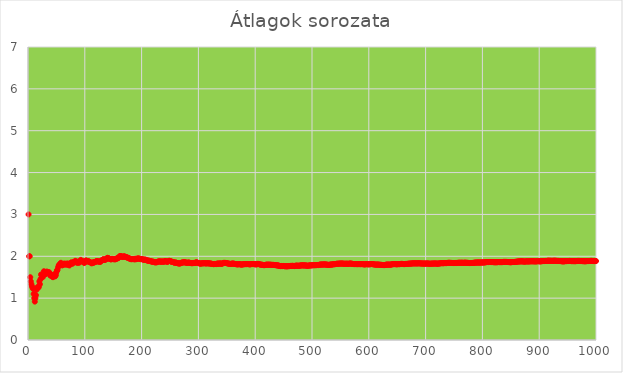
| Category | Series 0 |
|---|---|
| 1.0 | 3 |
| 2.0 | 2 |
| 3.0 | 2 |
| 4.0 | 1.5 |
| 5.0 | 1.4 |
| 6.0 | 1.333 |
| 7.0 | 1.286 |
| 8.0 | 1.25 |
| 9.0 | 1.222 |
| 10.0 | 1.1 |
| 11.0 | 1 |
| 12.0 | 0.917 |
| 13.0 | 1 |
| 14.0 | 1.071 |
| 15.0 | 1.2 |
| 16.0 | 1.25 |
| 17.0 | 1.235 |
| 18.0 | 1.278 |
| 19.0 | 1.263 |
| 20.0 | 1.4 |
| 21.0 | 1.333 |
| 22.0 | 1.455 |
| 23.0 | 1.565 |
| 24.0 | 1.542 |
| 25.0 | 1.52 |
| 26.0 | 1.5 |
| 27.0 | 1.556 |
| 28.0 | 1.643 |
| 29.0 | 1.621 |
| 30.0 | 1.567 |
| 31.0 | 1.581 |
| 32.0 | 1.594 |
| 33.0 | 1.636 |
| 34.0 | 1.618 |
| 35.0 | 1.6 |
| 36.0 | 1.611 |
| 37.0 | 1.622 |
| 38.0 | 1.579 |
| 39.0 | 1.538 |
| 40.0 | 1.575 |
| 41.0 | 1.537 |
| 42.0 | 1.548 |
| 43.0 | 1.512 |
| 44.0 | 1.5 |
| 45.0 | 1.556 |
| 46.0 | 1.565 |
| 47.0 | 1.532 |
| 48.0 | 1.521 |
| 49.0 | 1.551 |
| 50.0 | 1.62 |
| 51.0 | 1.667 |
| 52.0 | 1.673 |
| 53.0 | 1.736 |
| 54.0 | 1.778 |
| 55.0 | 1.8 |
| 56.0 | 1.804 |
| 57.0 | 1.825 |
| 58.0 | 1.845 |
| 59.0 | 1.814 |
| 60.0 | 1.783 |
| 61.0 | 1.787 |
| 62.0 | 1.806 |
| 63.0 | 1.81 |
| 64.0 | 1.828 |
| 65.0 | 1.8 |
| 66.0 | 1.818 |
| 67.0 | 1.806 |
| 68.0 | 1.824 |
| 69.0 | 1.797 |
| 70.0 | 1.829 |
| 71.0 | 1.817 |
| 72.0 | 1.792 |
| 73.0 | 1.781 |
| 74.0 | 1.824 |
| 75.0 | 1.813 |
| 76.0 | 1.855 |
| 77.0 | 1.844 |
| 78.0 | 1.821 |
| 79.0 | 1.848 |
| 80.0 | 1.862 |
| 81.0 | 1.852 |
| 82.0 | 1.854 |
| 83.0 | 1.892 |
| 84.0 | 1.881 |
| 85.0 | 1.859 |
| 86.0 | 1.86 |
| 87.0 | 1.839 |
| 88.0 | 1.875 |
| 89.0 | 1.865 |
| 90.0 | 1.844 |
| 91.0 | 1.879 |
| 92.0 | 1.88 |
| 93.0 | 1.914 |
| 94.0 | 1.894 |
| 95.0 | 1.874 |
| 96.0 | 1.885 |
| 97.0 | 1.876 |
| 98.0 | 1.857 |
| 99.0 | 1.838 |
| 100.0 | 1.87 |
| 101.0 | 1.871 |
| 102.0 | 1.902 |
| 103.0 | 1.893 |
| 104.0 | 1.875 |
| 105.0 | 1.876 |
| 106.0 | 1.887 |
| 107.0 | 1.879 |
| 108.0 | 1.861 |
| 109.0 | 1.862 |
| 110.0 | 1.855 |
| 111.0 | 1.847 |
| 112.0 | 1.83 |
| 113.0 | 1.841 |
| 114.0 | 1.842 |
| 115.0 | 1.861 |
| 116.0 | 1.845 |
| 117.0 | 1.863 |
| 118.0 | 1.864 |
| 119.0 | 1.866 |
| 120.0 | 1.883 |
| 121.0 | 1.884 |
| 122.0 | 1.877 |
| 123.0 | 1.878 |
| 124.0 | 1.879 |
| 125.0 | 1.872 |
| 126.0 | 1.873 |
| 127.0 | 1.866 |
| 128.0 | 1.875 |
| 129.0 | 1.899 |
| 130.0 | 1.9 |
| 131.0 | 1.908 |
| 132.0 | 1.924 |
| 133.0 | 1.932 |
| 134.0 | 1.918 |
| 135.0 | 1.911 |
| 136.0 | 1.926 |
| 137.0 | 1.92 |
| 138.0 | 1.935 |
| 139.0 | 1.957 |
| 140.0 | 1.964 |
| 141.0 | 1.957 |
| 142.0 | 1.951 |
| 143.0 | 1.944 |
| 144.0 | 1.938 |
| 145.0 | 1.931 |
| 146.0 | 1.925 |
| 147.0 | 1.932 |
| 148.0 | 1.939 |
| 149.0 | 1.933 |
| 150.0 | 1.933 |
| 151.0 | 1.927 |
| 152.0 | 1.934 |
| 153.0 | 1.928 |
| 154.0 | 1.929 |
| 155.0 | 1.942 |
| 156.0 | 1.936 |
| 157.0 | 1.955 |
| 158.0 | 1.962 |
| 159.0 | 1.956 |
| 160.0 | 1.975 |
| 161.0 | 1.994 |
| 162.0 | 2.006 |
| 163.0 | 2.006 |
| 164.0 | 2 |
| 165.0 | 1.988 |
| 166.0 | 1.994 |
| 167.0 | 1.982 |
| 168.0 | 1.994 |
| 169.0 | 2 |
| 170.0 | 1.988 |
| 171.0 | 1.994 |
| 172.0 | 1.983 |
| 173.0 | 1.983 |
| 174.0 | 1.971 |
| 175.0 | 1.966 |
| 176.0 | 1.966 |
| 177.0 | 1.96 |
| 178.0 | 1.949 |
| 179.0 | 1.944 |
| 180.0 | 1.939 |
| 181.0 | 1.934 |
| 182.0 | 1.929 |
| 183.0 | 1.934 |
| 184.0 | 1.935 |
| 185.0 | 1.93 |
| 186.0 | 1.935 |
| 187.0 | 1.93 |
| 188.0 | 1.926 |
| 189.0 | 1.942 |
| 190.0 | 1.932 |
| 191.0 | 1.932 |
| 192.0 | 1.943 |
| 193.0 | 1.948 |
| 194.0 | 1.948 |
| 195.0 | 1.944 |
| 196.0 | 1.944 |
| 197.0 | 1.939 |
| 198.0 | 1.934 |
| 199.0 | 1.93 |
| 200.0 | 1.935 |
| 201.0 | 1.93 |
| 202.0 | 1.926 |
| 203.0 | 1.921 |
| 204.0 | 1.917 |
| 205.0 | 1.917 |
| 206.0 | 1.922 |
| 207.0 | 1.918 |
| 208.0 | 1.909 |
| 209.0 | 1.904 |
| 210.0 | 1.9 |
| 211.0 | 1.896 |
| 212.0 | 1.892 |
| 213.0 | 1.897 |
| 214.0 | 1.888 |
| 215.0 | 1.884 |
| 216.0 | 1.884 |
| 217.0 | 1.88 |
| 218.0 | 1.872 |
| 219.0 | 1.868 |
| 220.0 | 1.873 |
| 221.0 | 1.869 |
| 222.0 | 1.86 |
| 223.0 | 1.861 |
| 224.0 | 1.853 |
| 225.0 | 1.862 |
| 226.0 | 1.854 |
| 227.0 | 1.859 |
| 228.0 | 1.864 |
| 229.0 | 1.873 |
| 230.0 | 1.878 |
| 231.0 | 1.879 |
| 232.0 | 1.875 |
| 233.0 | 1.876 |
| 234.0 | 1.868 |
| 235.0 | 1.877 |
| 236.0 | 1.873 |
| 237.0 | 1.873 |
| 238.0 | 1.87 |
| 239.0 | 1.874 |
| 240.0 | 1.871 |
| 241.0 | 1.884 |
| 242.0 | 1.884 |
| 243.0 | 1.881 |
| 244.0 | 1.873 |
| 245.0 | 1.869 |
| 246.0 | 1.87 |
| 247.0 | 1.879 |
| 248.0 | 1.891 |
| 249.0 | 1.892 |
| 250.0 | 1.888 |
| 251.0 | 1.88 |
| 252.0 | 1.873 |
| 253.0 | 1.87 |
| 254.0 | 1.87 |
| 255.0 | 1.863 |
| 256.0 | 1.859 |
| 257.0 | 1.852 |
| 258.0 | 1.845 |
| 259.0 | 1.853 |
| 260.0 | 1.85 |
| 261.0 | 1.847 |
| 262.0 | 1.84 |
| 263.0 | 1.837 |
| 264.0 | 1.833 |
| 265.0 | 1.83 |
| 266.0 | 1.827 |
| 267.0 | 1.831 |
| 268.0 | 1.828 |
| 269.0 | 1.836 |
| 270.0 | 1.844 |
| 271.0 | 1.849 |
| 272.0 | 1.853 |
| 273.0 | 1.853 |
| 274.0 | 1.854 |
| 275.0 | 1.858 |
| 276.0 | 1.855 |
| 277.0 | 1.856 |
| 278.0 | 1.849 |
| 279.0 | 1.846 |
| 280.0 | 1.843 |
| 281.0 | 1.847 |
| 282.0 | 1.848 |
| 283.0 | 1.848 |
| 284.0 | 1.849 |
| 285.0 | 1.842 |
| 286.0 | 1.839 |
| 287.0 | 1.836 |
| 288.0 | 1.833 |
| 289.0 | 1.841 |
| 290.0 | 1.834 |
| 291.0 | 1.838 |
| 292.0 | 1.842 |
| 293.0 | 1.843 |
| 294.0 | 1.837 |
| 295.0 | 1.847 |
| 296.0 | 1.855 |
| 297.0 | 1.855 |
| 298.0 | 1.849 |
| 299.0 | 1.843 |
| 300.0 | 1.84 |
| 301.0 | 1.834 |
| 302.0 | 1.828 |
| 303.0 | 1.828 |
| 304.0 | 1.826 |
| 305.0 | 1.83 |
| 306.0 | 1.827 |
| 307.0 | 1.837 |
| 308.0 | 1.831 |
| 309.0 | 1.835 |
| 310.0 | 1.832 |
| 311.0 | 1.836 |
| 312.0 | 1.833 |
| 313.0 | 1.831 |
| 314.0 | 1.828 |
| 315.0 | 1.835 |
| 316.0 | 1.832 |
| 317.0 | 1.833 |
| 318.0 | 1.833 |
| 319.0 | 1.831 |
| 320.0 | 1.825 |
| 321.0 | 1.829 |
| 322.0 | 1.826 |
| 323.0 | 1.82 |
| 324.0 | 1.818 |
| 325.0 | 1.818 |
| 326.0 | 1.816 |
| 327.0 | 1.81 |
| 328.0 | 1.817 |
| 329.0 | 1.818 |
| 330.0 | 1.815 |
| 331.0 | 1.819 |
| 332.0 | 1.813 |
| 333.0 | 1.823 |
| 334.0 | 1.829 |
| 335.0 | 1.824 |
| 336.0 | 1.818 |
| 337.0 | 1.828 |
| 338.0 | 1.831 |
| 339.0 | 1.826 |
| 340.0 | 1.824 |
| 341.0 | 1.818 |
| 342.0 | 1.825 |
| 343.0 | 1.834 |
| 344.0 | 1.843 |
| 345.0 | 1.841 |
| 346.0 | 1.844 |
| 347.0 | 1.839 |
| 348.0 | 1.842 |
| 349.0 | 1.84 |
| 350.0 | 1.834 |
| 351.0 | 1.832 |
| 352.0 | 1.827 |
| 353.0 | 1.827 |
| 354.0 | 1.822 |
| 355.0 | 1.82 |
| 356.0 | 1.817 |
| 357.0 | 1.821 |
| 358.0 | 1.818 |
| 359.0 | 1.825 |
| 360.0 | 1.825 |
| 361.0 | 1.825 |
| 362.0 | 1.823 |
| 363.0 | 1.821 |
| 364.0 | 1.819 |
| 365.0 | 1.814 |
| 366.0 | 1.811 |
| 367.0 | 1.812 |
| 368.0 | 1.807 |
| 369.0 | 1.808 |
| 370.0 | 1.808 |
| 371.0 | 1.811 |
| 372.0 | 1.815 |
| 373.0 | 1.81 |
| 374.0 | 1.805 |
| 375.0 | 1.805 |
| 376.0 | 1.801 |
| 377.0 | 1.804 |
| 378.0 | 1.807 |
| 379.0 | 1.81 |
| 380.0 | 1.813 |
| 381.0 | 1.808 |
| 382.0 | 1.814 |
| 383.0 | 1.812 |
| 384.0 | 1.815 |
| 385.0 | 1.81 |
| 386.0 | 1.816 |
| 387.0 | 1.814 |
| 388.0 | 1.812 |
| 389.0 | 1.812 |
| 390.0 | 1.808 |
| 391.0 | 1.806 |
| 392.0 | 1.811 |
| 393.0 | 1.814 |
| 394.0 | 1.812 |
| 395.0 | 1.815 |
| 396.0 | 1.813 |
| 397.0 | 1.816 |
| 398.0 | 1.812 |
| 399.0 | 1.81 |
| 400.0 | 1.81 |
| 401.0 | 1.81 |
| 402.0 | 1.806 |
| 403.0 | 1.809 |
| 404.0 | 1.817 |
| 405.0 | 1.82 |
| 406.0 | 1.815 |
| 407.0 | 1.811 |
| 408.0 | 1.806 |
| 409.0 | 1.802 |
| 410.0 | 1.8 |
| 411.0 | 1.798 |
| 412.0 | 1.799 |
| 413.0 | 1.797 |
| 414.0 | 1.792 |
| 415.0 | 1.788 |
| 416.0 | 1.788 |
| 417.0 | 1.789 |
| 418.0 | 1.794 |
| 419.0 | 1.8 |
| 420.0 | 1.798 |
| 421.0 | 1.8 |
| 422.0 | 1.801 |
| 423.0 | 1.797 |
| 424.0 | 1.797 |
| 425.0 | 1.802 |
| 426.0 | 1.798 |
| 427.0 | 1.796 |
| 428.0 | 1.797 |
| 429.0 | 1.797 |
| 430.0 | 1.793 |
| 431.0 | 1.796 |
| 432.0 | 1.794 |
| 433.0 | 1.794 |
| 434.0 | 1.79 |
| 435.0 | 1.791 |
| 436.0 | 1.789 |
| 437.0 | 1.785 |
| 438.0 | 1.783 |
| 439.0 | 1.784 |
| 440.0 | 1.782 |
| 441.0 | 1.778 |
| 442.0 | 1.774 |
| 443.0 | 1.77 |
| 444.0 | 1.766 |
| 445.0 | 1.764 |
| 446.0 | 1.769 |
| 447.0 | 1.765 |
| 448.0 | 1.766 |
| 449.0 | 1.768 |
| 450.0 | 1.769 |
| 451.0 | 1.765 |
| 452.0 | 1.763 |
| 453.0 | 1.762 |
| 454.0 | 1.762 |
| 455.0 | 1.763 |
| 456.0 | 1.759 |
| 457.0 | 1.761 |
| 458.0 | 1.766 |
| 459.0 | 1.763 |
| 460.0 | 1.765 |
| 461.0 | 1.768 |
| 462.0 | 1.771 |
| 463.0 | 1.769 |
| 464.0 | 1.767 |
| 465.0 | 1.774 |
| 466.0 | 1.77 |
| 467.0 | 1.771 |
| 468.0 | 1.769 |
| 469.0 | 1.765 |
| 470.0 | 1.772 |
| 471.0 | 1.773 |
| 472.0 | 1.775 |
| 473.0 | 1.776 |
| 474.0 | 1.776 |
| 475.0 | 1.773 |
| 476.0 | 1.773 |
| 477.0 | 1.771 |
| 478.0 | 1.778 |
| 479.0 | 1.777 |
| 480.0 | 1.779 |
| 481.0 | 1.782 |
| 482.0 | 1.784 |
| 483.0 | 1.785 |
| 484.0 | 1.781 |
| 485.0 | 1.784 |
| 486.0 | 1.782 |
| 487.0 | 1.778 |
| 488.0 | 1.783 |
| 489.0 | 1.781 |
| 490.0 | 1.778 |
| 491.0 | 1.774 |
| 492.0 | 1.774 |
| 493.0 | 1.773 |
| 494.0 | 1.777 |
| 495.0 | 1.782 |
| 496.0 | 1.778 |
| 497.0 | 1.785 |
| 498.0 | 1.783 |
| 499.0 | 1.784 |
| 500.0 | 1.784 |
| 501.0 | 1.784 |
| 502.0 | 1.789 |
| 503.0 | 1.789 |
| 504.0 | 1.786 |
| 505.0 | 1.788 |
| 506.0 | 1.787 |
| 507.0 | 1.789 |
| 508.0 | 1.787 |
| 509.0 | 1.792 |
| 510.0 | 1.792 |
| 511.0 | 1.789 |
| 512.0 | 1.793 |
| 513.0 | 1.797 |
| 514.0 | 1.802 |
| 515.0 | 1.802 |
| 516.0 | 1.802 |
| 517.0 | 1.801 |
| 518.0 | 1.803 |
| 519.0 | 1.805 |
| 520.0 | 1.802 |
| 521.0 | 1.806 |
| 522.0 | 1.805 |
| 523.0 | 1.807 |
| 524.0 | 1.803 |
| 525.0 | 1.8 |
| 526.0 | 1.8 |
| 527.0 | 1.799 |
| 528.0 | 1.797 |
| 529.0 | 1.796 |
| 530.0 | 1.792 |
| 531.0 | 1.797 |
| 532.0 | 1.803 |
| 533.0 | 1.803 |
| 534.0 | 1.803 |
| 535.0 | 1.802 |
| 536.0 | 1.804 |
| 537.0 | 1.808 |
| 538.0 | 1.814 |
| 539.0 | 1.811 |
| 540.0 | 1.809 |
| 541.0 | 1.815 |
| 542.0 | 1.817 |
| 543.0 | 1.82 |
| 544.0 | 1.824 |
| 545.0 | 1.82 |
| 546.0 | 1.822 |
| 547.0 | 1.823 |
| 548.0 | 1.825 |
| 549.0 | 1.825 |
| 550.0 | 1.825 |
| 551.0 | 1.826 |
| 552.0 | 1.826 |
| 553.0 | 1.826 |
| 554.0 | 1.825 |
| 555.0 | 1.823 |
| 556.0 | 1.822 |
| 557.0 | 1.82 |
| 558.0 | 1.823 |
| 559.0 | 1.821 |
| 560.0 | 1.821 |
| 561.0 | 1.824 |
| 562.0 | 1.822 |
| 563.0 | 1.819 |
| 564.0 | 1.821 |
| 565.0 | 1.821 |
| 566.0 | 1.825 |
| 567.0 | 1.827 |
| 568.0 | 1.824 |
| 569.0 | 1.824 |
| 570.0 | 1.823 |
| 571.0 | 1.82 |
| 572.0 | 1.816 |
| 573.0 | 1.815 |
| 574.0 | 1.812 |
| 575.0 | 1.814 |
| 576.0 | 1.812 |
| 577.0 | 1.815 |
| 578.0 | 1.813 |
| 579.0 | 1.812 |
| 580.0 | 1.814 |
| 581.0 | 1.811 |
| 582.0 | 1.814 |
| 583.0 | 1.815 |
| 584.0 | 1.813 |
| 585.0 | 1.81 |
| 586.0 | 1.812 |
| 587.0 | 1.814 |
| 588.0 | 1.811 |
| 589.0 | 1.813 |
| 590.0 | 1.81 |
| 591.0 | 1.809 |
| 592.0 | 1.807 |
| 593.0 | 1.804 |
| 594.0 | 1.81 |
| 595.0 | 1.81 |
| 596.0 | 1.812 |
| 597.0 | 1.811 |
| 598.0 | 1.809 |
| 599.0 | 1.808 |
| 600.0 | 1.807 |
| 601.0 | 1.812 |
| 602.0 | 1.809 |
| 603.0 | 1.811 |
| 604.0 | 1.816 |
| 605.0 | 1.815 |
| 606.0 | 1.812 |
| 607.0 | 1.812 |
| 608.0 | 1.809 |
| 609.0 | 1.806 |
| 610.0 | 1.805 |
| 611.0 | 1.804 |
| 612.0 | 1.802 |
| 613.0 | 1.799 |
| 614.0 | 1.801 |
| 615.0 | 1.803 |
| 616.0 | 1.802 |
| 617.0 | 1.801 |
| 618.0 | 1.799 |
| 619.0 | 1.798 |
| 620.0 | 1.797 |
| 621.0 | 1.795 |
| 622.0 | 1.796 |
| 623.0 | 1.795 |
| 624.0 | 1.792 |
| 625.0 | 1.789 |
| 626.0 | 1.791 |
| 627.0 | 1.788 |
| 628.0 | 1.791 |
| 629.0 | 1.792 |
| 630.0 | 1.797 |
| 631.0 | 1.802 |
| 632.0 | 1.799 |
| 633.0 | 1.803 |
| 634.0 | 1.8 |
| 635.0 | 1.8 |
| 636.0 | 1.8 |
| 637.0 | 1.801 |
| 638.0 | 1.799 |
| 639.0 | 1.801 |
| 640.0 | 1.805 |
| 641.0 | 1.81 |
| 642.0 | 1.812 |
| 643.0 | 1.81 |
| 644.0 | 1.814 |
| 645.0 | 1.812 |
| 646.0 | 1.813 |
| 647.0 | 1.811 |
| 648.0 | 1.81 |
| 649.0 | 1.81 |
| 650.0 | 1.808 |
| 651.0 | 1.813 |
| 652.0 | 1.813 |
| 653.0 | 1.812 |
| 654.0 | 1.812 |
| 655.0 | 1.812 |
| 656.0 | 1.816 |
| 657.0 | 1.82 |
| 658.0 | 1.818 |
| 659.0 | 1.819 |
| 660.0 | 1.817 |
| 661.0 | 1.814 |
| 662.0 | 1.813 |
| 663.0 | 1.813 |
| 664.0 | 1.815 |
| 665.0 | 1.818 |
| 666.0 | 1.818 |
| 667.0 | 1.817 |
| 668.0 | 1.819 |
| 669.0 | 1.822 |
| 670.0 | 1.821 |
| 671.0 | 1.823 |
| 672.0 | 1.826 |
| 673.0 | 1.825 |
| 674.0 | 1.825 |
| 675.0 | 1.828 |
| 676.0 | 1.827 |
| 677.0 | 1.83 |
| 678.0 | 1.832 |
| 679.0 | 1.832 |
| 680.0 | 1.829 |
| 681.0 | 1.831 |
| 682.0 | 1.831 |
| 683.0 | 1.832 |
| 684.0 | 1.83 |
| 685.0 | 1.831 |
| 686.0 | 1.829 |
| 687.0 | 1.833 |
| 688.0 | 1.834 |
| 689.0 | 1.832 |
| 690.0 | 1.83 |
| 691.0 | 1.829 |
| 692.0 | 1.829 |
| 693.0 | 1.827 |
| 694.0 | 1.827 |
| 695.0 | 1.827 |
| 696.0 | 1.826 |
| 697.0 | 1.825 |
| 698.0 | 1.825 |
| 699.0 | 1.825 |
| 700.0 | 1.827 |
| 701.0 | 1.826 |
| 702.0 | 1.828 |
| 703.0 | 1.826 |
| 704.0 | 1.828 |
| 705.0 | 1.826 |
| 706.0 | 1.824 |
| 707.0 | 1.822 |
| 708.0 | 1.822 |
| 709.0 | 1.824 |
| 710.0 | 1.823 |
| 711.0 | 1.827 |
| 712.0 | 1.824 |
| 713.0 | 1.825 |
| 714.0 | 1.826 |
| 715.0 | 1.828 |
| 716.0 | 1.827 |
| 717.0 | 1.827 |
| 718.0 | 1.827 |
| 719.0 | 1.826 |
| 720.0 | 1.825 |
| 721.0 | 1.822 |
| 722.0 | 1.825 |
| 723.0 | 1.826 |
| 724.0 | 1.829 |
| 725.0 | 1.83 |
| 726.0 | 1.832 |
| 727.0 | 1.835 |
| 728.0 | 1.835 |
| 729.0 | 1.835 |
| 730.0 | 1.834 |
| 731.0 | 1.834 |
| 732.0 | 1.835 |
| 733.0 | 1.839 |
| 734.0 | 1.837 |
| 735.0 | 1.838 |
| 736.0 | 1.836 |
| 737.0 | 1.837 |
| 738.0 | 1.841 |
| 739.0 | 1.842 |
| 740.0 | 1.845 |
| 741.0 | 1.845 |
| 742.0 | 1.845 |
| 743.0 | 1.843 |
| 744.0 | 1.843 |
| 745.0 | 1.843 |
| 746.0 | 1.84 |
| 747.0 | 1.839 |
| 748.0 | 1.84 |
| 749.0 | 1.838 |
| 750.0 | 1.839 |
| 751.0 | 1.839 |
| 752.0 | 1.839 |
| 753.0 | 1.841 |
| 754.0 | 1.838 |
| 755.0 | 1.842 |
| 756.0 | 1.843 |
| 757.0 | 1.843 |
| 758.0 | 1.846 |
| 759.0 | 1.846 |
| 760.0 | 1.846 |
| 761.0 | 1.844 |
| 762.0 | 1.844 |
| 763.0 | 1.847 |
| 764.0 | 1.847 |
| 765.0 | 1.844 |
| 766.0 | 1.843 |
| 767.0 | 1.844 |
| 768.0 | 1.846 |
| 769.0 | 1.845 |
| 770.0 | 1.848 |
| 771.0 | 1.846 |
| 772.0 | 1.843 |
| 773.0 | 1.845 |
| 774.0 | 1.844 |
| 775.0 | 1.843 |
| 776.0 | 1.84 |
| 777.0 | 1.838 |
| 778.0 | 1.838 |
| 779.0 | 1.84 |
| 780.0 | 1.84 |
| 781.0 | 1.84 |
| 782.0 | 1.841 |
| 783.0 | 1.842 |
| 784.0 | 1.842 |
| 785.0 | 1.845 |
| 786.0 | 1.847 |
| 787.0 | 1.848 |
| 788.0 | 1.849 |
| 789.0 | 1.849 |
| 790.0 | 1.851 |
| 791.0 | 1.848 |
| 792.0 | 1.852 |
| 793.0 | 1.852 |
| 794.0 | 1.85 |
| 795.0 | 1.849 |
| 796.0 | 1.851 |
| 797.0 | 1.851 |
| 798.0 | 1.852 |
| 799.0 | 1.852 |
| 800.0 | 1.852 |
| 801.0 | 1.853 |
| 802.0 | 1.852 |
| 803.0 | 1.856 |
| 804.0 | 1.853 |
| 805.0 | 1.857 |
| 806.0 | 1.859 |
| 807.0 | 1.86 |
| 808.0 | 1.861 |
| 809.0 | 1.863 |
| 810.0 | 1.862 |
| 811.0 | 1.861 |
| 812.0 | 1.862 |
| 813.0 | 1.865 |
| 814.0 | 1.862 |
| 815.0 | 1.861 |
| 816.0 | 1.862 |
| 817.0 | 1.863 |
| 818.0 | 1.862 |
| 819.0 | 1.861 |
| 820.0 | 1.859 |
| 821.0 | 1.859 |
| 822.0 | 1.858 |
| 823.0 | 1.858 |
| 824.0 | 1.858 |
| 825.0 | 1.858 |
| 826.0 | 1.858 |
| 827.0 | 1.86 |
| 828.0 | 1.862 |
| 829.0 | 1.861 |
| 830.0 | 1.86 |
| 831.0 | 1.859 |
| 832.0 | 1.862 |
| 833.0 | 1.86 |
| 834.0 | 1.861 |
| 835.0 | 1.86 |
| 836.0 | 1.862 |
| 837.0 | 1.865 |
| 838.0 | 1.868 |
| 839.0 | 1.865 |
| 840.0 | 1.865 |
| 841.0 | 1.867 |
| 842.0 | 1.866 |
| 843.0 | 1.865 |
| 844.0 | 1.864 |
| 845.0 | 1.863 |
| 846.0 | 1.862 |
| 847.0 | 1.861 |
| 848.0 | 1.86 |
| 849.0 | 1.859 |
| 850.0 | 1.856 |
| 851.0 | 1.86 |
| 852.0 | 1.864 |
| 853.0 | 1.863 |
| 854.0 | 1.862 |
| 855.0 | 1.863 |
| 856.0 | 1.863 |
| 857.0 | 1.865 |
| 858.0 | 1.868 |
| 859.0 | 1.868 |
| 860.0 | 1.869 |
| 861.0 | 1.872 |
| 862.0 | 1.874 |
| 863.0 | 1.876 |
| 864.0 | 1.875 |
| 865.0 | 1.877 |
| 866.0 | 1.879 |
| 867.0 | 1.878 |
| 868.0 | 1.88 |
| 869.0 | 1.879 |
| 870.0 | 1.879 |
| 871.0 | 1.878 |
| 872.0 | 1.876 |
| 873.0 | 1.875 |
| 874.0 | 1.873 |
| 875.0 | 1.873 |
| 876.0 | 1.877 |
| 877.0 | 1.878 |
| 878.0 | 1.878 |
| 879.0 | 1.879 |
| 880.0 | 1.878 |
| 881.0 | 1.876 |
| 882.0 | 1.878 |
| 883.0 | 1.879 |
| 884.0 | 1.881 |
| 885.0 | 1.881 |
| 886.0 | 1.88 |
| 887.0 | 1.882 |
| 888.0 | 1.881 |
| 889.0 | 1.881 |
| 890.0 | 1.88 |
| 891.0 | 1.879 |
| 892.0 | 1.88 |
| 893.0 | 1.879 |
| 894.0 | 1.878 |
| 895.0 | 1.879 |
| 896.0 | 1.879 |
| 897.0 | 1.883 |
| 898.0 | 1.883 |
| 899.0 | 1.882 |
| 900.0 | 1.881 |
| 901.0 | 1.88 |
| 902.0 | 1.879 |
| 903.0 | 1.882 |
| 904.0 | 1.881 |
| 905.0 | 1.884 |
| 906.0 | 1.885 |
| 907.0 | 1.885 |
| 908.0 | 1.888 |
| 909.0 | 1.886 |
| 910.0 | 1.888 |
| 911.0 | 1.889 |
| 912.0 | 1.887 |
| 913.0 | 1.888 |
| 914.0 | 1.891 |
| 915.0 | 1.893 |
| 916.0 | 1.894 |
| 917.0 | 1.893 |
| 918.0 | 1.892 |
| 919.0 | 1.893 |
| 920.0 | 1.892 |
| 921.0 | 1.891 |
| 922.0 | 1.892 |
| 923.0 | 1.891 |
| 924.0 | 1.893 |
| 925.0 | 1.891 |
| 926.0 | 1.894 |
| 927.0 | 1.893 |
| 928.0 | 1.893 |
| 929.0 | 1.892 |
| 930.0 | 1.891 |
| 931.0 | 1.89 |
| 932.0 | 1.888 |
| 933.0 | 1.891 |
| 934.0 | 1.889 |
| 935.0 | 1.888 |
| 936.0 | 1.887 |
| 937.0 | 1.887 |
| 938.0 | 1.885 |
| 939.0 | 1.883 |
| 940.0 | 1.881 |
| 941.0 | 1.881 |
| 942.0 | 1.88 |
| 943.0 | 1.878 |
| 944.0 | 1.88 |
| 945.0 | 1.884 |
| 946.0 | 1.884 |
| 947.0 | 1.885 |
| 948.0 | 1.884 |
| 949.0 | 1.885 |
| 950.0 | 1.886 |
| 951.0 | 1.886 |
| 952.0 | 1.887 |
| 953.0 | 1.89 |
| 954.0 | 1.889 |
| 955.0 | 1.887 |
| 956.0 | 1.885 |
| 957.0 | 1.884 |
| 958.0 | 1.883 |
| 959.0 | 1.885 |
| 960.0 | 1.884 |
| 961.0 | 1.882 |
| 962.0 | 1.884 |
| 963.0 | 1.884 |
| 964.0 | 1.882 |
| 965.0 | 1.885 |
| 966.0 | 1.886 |
| 967.0 | 1.887 |
| 968.0 | 1.889 |
| 969.0 | 1.89 |
| 970.0 | 1.889 |
| 971.0 | 1.889 |
| 972.0 | 1.887 |
| 973.0 | 1.886 |
| 974.0 | 1.887 |
| 975.0 | 1.885 |
| 976.0 | 1.884 |
| 977.0 | 1.883 |
| 978.0 | 1.883 |
| 979.0 | 1.883 |
| 980.0 | 1.881 |
| 981.0 | 1.882 |
| 982.0 | 1.883 |
| 983.0 | 1.883 |
| 984.0 | 1.884 |
| 985.0 | 1.886 |
| 986.0 | 1.885 |
| 987.0 | 1.886 |
| 988.0 | 1.888 |
| 989.0 | 1.888 |
| 990.0 | 1.889 |
| 991.0 | 1.89 |
| 992.0 | 1.891 |
| 993.0 | 1.889 |
| 994.0 | 1.888 |
| 995.0 | 1.887 |
| 996.0 | 1.886 |
| 997.0 | 1.885 |
| 998.0 | 1.887 |
| 999.0 | 1.885 |
| 1000.0 | 1.886 |